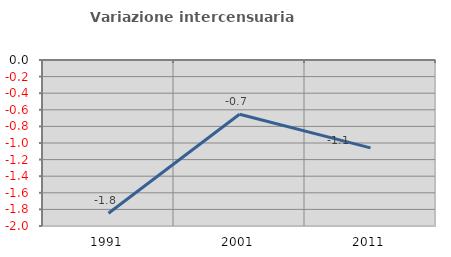
| Category | Variazione intercensuaria annua |
|---|---|
| 1991.0 | -1.847 |
| 2001.0 | -0.654 |
| 2011.0 | -1.058 |